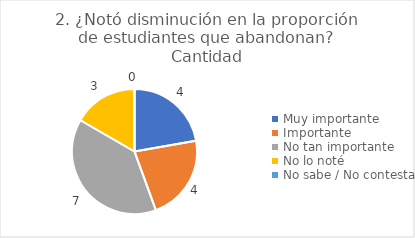
| Category | 2. ¿Notó disminución en la proporción de estudiantes que abandonan? |
|---|---|
| Muy importante  | 0.222 |
| Importante  | 0.222 |
| No tan importante  | 0.389 |
| No lo noté  | 0.167 |
| No sabe / No contesta | 0 |